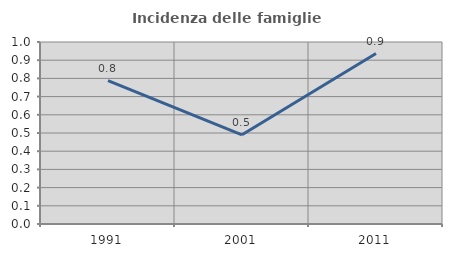
| Category | Incidenza delle famiglie numerose |
|---|---|
| 1991.0 | 0.787 |
| 2001.0 | 0.49 |
| 2011.0 | 0.937 |